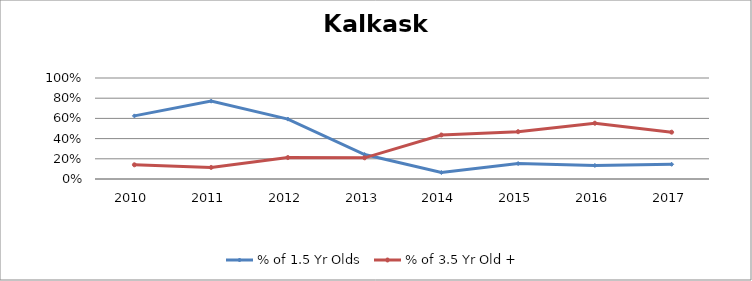
| Category | % of 1.5 Yr Olds | % of 3.5 Yr Old + |
|---|---|---|
| 2010.0 | 0.625 | 0.141 |
| 2011.0 | 0.771 | 0.115 |
| 2012.0 | 0.593 | 0.212 |
| 2013.0 | 0.242 | 0.21 |
| 2014.0 | 0.064 | 0.436 |
| 2015.0 | 0.153 | 0.468 |
| 2016.0 | 0.134 | 0.552 |
| 2017.0 | 0.145 | 0.464 |